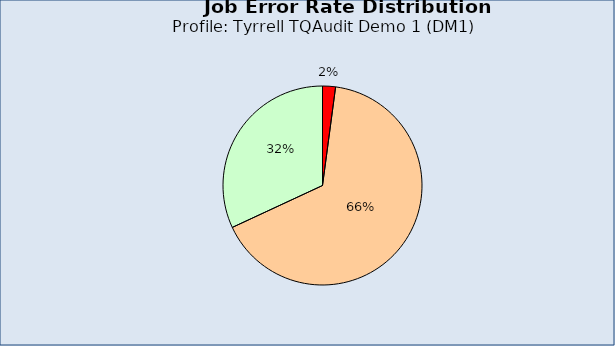
| Category | Series 0 |
|---|---|
| 0 | 0.021 |
| 1 | 0.66 |
| 2 | 0.319 |